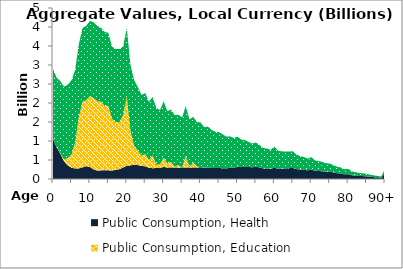
| Category | Public Consumption, Health | Public Consumption, Education | Public Consumption, Other than health and education |
|---|---|---|---|
| 0 | 1052.669 | 0 | 1842.281 |
|  | 830.897 | 6.875 | 1826.668 |
| 2 | 663.395 | 21.88 | 1892.662 |
| 3 | 463.126 | 52.154 | 1916.609 |
| 4 | 356.403 | 195.473 | 1929.416 |
| 5 | 300.4 | 335.61 | 1962.083 |
| 6 | 274.296 | 680.984 | 1915.083 |
| 7 | 279.563 | 1350.803 | 1916.327 |
| 8 | 305.872 | 1728.104 | 1939.259 |
| 9 | 339.216 | 1733.906 | 1957.402 |
| 10 | 314.381 | 1865.324 | 1978.736 |
| 11 | 253.811 | 1873.445 | 2001.152 |
| 12 | 220.105 | 1830.864 | 1979.878 |
| 13 | 225.625 | 1812.929 | 1938.641 |
| 14 | 233.839 | 1694.602 | 1942.907 |
| 15 | 228.247 | 1695.269 | 1923.81 |
| 16 | 223.279 | 1363.093 | 1896.323 |
| 17 | 238.745 | 1261.707 | 1919.329 |
| 18 | 259.741 | 1230.759 | 1929.323 |
| 19 | 300.129 | 1380.58 | 1803.438 |
| 20 | 346.724 | 1821.733 | 1809.42 |
| 21 | 359.337 | 909.184 | 1735.099 |
| 22 | 374.28 | 495.062 | 1730.804 |
| 23 | 364.919 | 387.159 | 1667.047 |
| 24 | 343.005 | 269.707 | 1598.595 |
| 25 | 335.459 | 321.309 | 1605.904 |
| 26 | 295.757 | 207.17 | 1530.324 |
| 27 | 283.782 | 333.053 | 1540.552 |
| 28 | 289.221 | 87.879 | 1500.608 |
| 29 | 294.359 | 87.357 | 1427.834 |
| 30 | 317.067 | 247.04 | 1480.807 |
| 31 | 302.228 | 103.364 | 1380.931 |
| 32 | 305.218 | 146.174 | 1376.081 |
| 33 | 303.547 | 21.506 | 1358.179 |
| 34 | 296.628 | 65.626 | 1328.014 |
| 35 | 302.028 | 1.685 | 1318.707 |
| 36 | 305.179 | 313.084 | 1302.039 |
| 37 | 298.298 | 9.343 | 1259.706 |
| 38 | 300.773 | 129.486 | 1207.959 |
| 39 | 300.268 | 33.467 | 1161.546 |
| 40 | 310.552 | 0 | 1181.616 |
| 41 | 289.815 | 7.62 | 1065.771 |
| 42 | 304.487 | 0 | 1075.975 |
| 43 | 291.757 | 0 | 999.441 |
| 44 | 288.107 | 0 | 956.584 |
| 45 | 291.385 | 0 | 941.659 |
| 46 | 282.076 | 2.729 | 890.799 |
| 47 | 278.959 | 0.977 | 834.838 |
| 48 | 295.58 | 0 | 826.669 |
| 49 | 295.741 | 0 | 782.902 |
| 50 | 318.847 | 5.912 | 790.669 |
| 51 | 311.959 | 0 | 726.654 |
| 52 | 320.638 | 0 | 705.63 |
| 53 | 316.15 | 0 | 661.599 |
| 54 | 307.753 | 0 | 625.764 |
| 55 | 321.08 | 1.868 | 637.77 |
| 56 | 303.462 | 0 | 591.221 |
| 57 | 278 | 1.371 | 534.499 |
| 58 | 274.596 | 0 | 527.03 |
| 59 | 264.189 | 0 | 503.064 |
| 60 | 299.272 | 0 | 555.3 |
| 61 | 270.514 | 0 | 477.732 |
| 62 | 270.195 | 1.58 | 456.499 |
| 63 | 277.52 | 0 | 444.358 |
| 64 | 284.343 | 0 | 437.54 |
| 65 | 292.85 | 0 | 437.218 |
| 66 | 260.549 | 0 | 382.41 |
| 67 | 247.574 | 0 | 357.501 |
| 68 | 242.284 | 0 | 338.289 |
| 69 | 227.399 | 0 | 308.418 |
| 70 | 249.302 | 0 | 327.852 |
| 71 | 215.081 | 0 | 275.059 |
| 72 | 211.593 | 0 | 262.846 |
| 73 | 204.147 | 0 | 246.657 |
| 74 | 190.801 | 0 | 223.925 |
| 75 | 190.006 | 0 | 217.418 |
| 76 | 173.477 | 0 | 195.518 |
| 77 | 152.771 | 0 | 171.367 |
| 78 | 143.809 | 0 | 160.402 |
| 79 | 122.053 | 0 | 134.689 |
| 80 | 128.935 | 0 | 140.14 |
| 81 | 97.097 | 0 | 103.35 |
| 82 | 88.399 | 0 | 91.315 |
| 83 | 79.297 | 0 | 79.466 |
| 84 | 76.34 | 0 | 74.705 |
| 85 | 69.978 | 0 | 67.395 |
| 86 | 58.226 | 0 | 55.305 |
| 87 | 48.957 | 0 | 44.818 |
| 88 | 43.215 | 0 | 36.707 |
| 89 | 38.723 | 0 | 29.33 |
| 90+ | 163.092 | 0 | 104.281 |